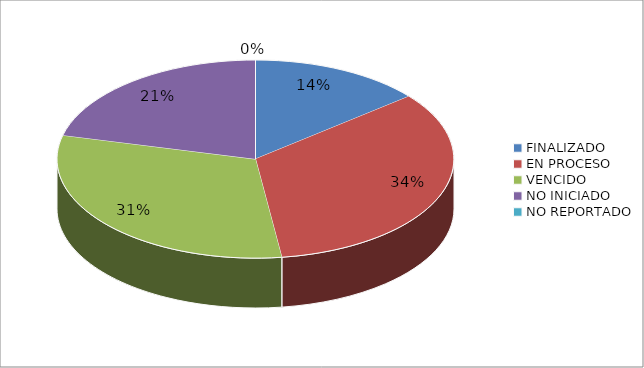
| Category | Series 0 |
|---|---|
| FINALIZADO | 10 |
| EN PROCESO | 24 |
| VENCIDO | 22 |
| NO INICIADO | 15 |
| NO REPORTADO | 0 |